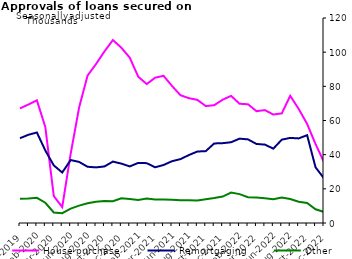
| Category | House purchase | Remortgaging | Other |
|---|---|---|---|
| Dec-2019 | 67092 | 49637 | 14252 |
| Jan-2020 | 69379 | 51656 | 14398 |
| Feb-2020 | 71805 | 52975 | 14713 |
| Mar-2020 | 56132 | 42424 | 11860 |
| Apr-2020 | 15789 | 33720 | 6146 |
| May-2020 | 9307 | 29560 | 5745 |
| Jun-2020 | 40523 | 36851 | 8426 |
| Jul-2020 | 67615 | 35757 | 10152 |
| Aug-2020 | 86290 | 32913 | 11586 |
| Sep-2020 | 93045 | 32547 | 12443 |
| Oct-2020 | 100414 | 33102 | 12909 |
| Nov-2020 | 107095 | 35948 | 12718 |
| Dec-2020 | 102616 | 34758 | 14508 |
| Jan-2021 | 96751 | 33130 | 14014 |
| Feb-2021 | 85649 | 35181 | 13481 |
| Mar-2021 | 81342 | 35029 | 14291 |
| Apr-2021 | 85050 | 32608 | 13761 |
| May-2021 | 86157 | 33959 | 13717 |
| Jun-2021 | 80218 | 36177 | 13608 |
| Jul-2021 | 74813 | 37389 | 13352 |
| Aug-2021 | 73064 | 39778 | 13356 |
| Sep-2021 | 72069 | 41843 | 13108 |
| Oct-2021 | 68455 | 42071 | 13962 |
| Nov-2021 | 68955 | 46568 | 14588 |
| Dec-2021 | 72181 | 46729 | 15458 |
| Jan-2022 | 74418 | 47270 | 17811 |
| Feb-2022 | 69796 | 49386 | 16909 |
| Mar-2022 | 69501 | 48945 | 15043 |
| Apr-2022 | 65455 | 46280 | 14911 |
| May-2022 | 66086 | 45878 | 14517 |
| Jun-2022 | 63487 | 43525 | 13868 |
| Jul-2022 | 64159 | 48782 | 14945 |
| Aug-2022 | 74443 | 49816 | 14085 |
| Sep-2022 | 66785 | 49510 | 12405 |
| Oct-2022 | 58018 | 51407 | 11688 |
| Nov-2022 | 46186 | 32588 | 8023 |
| Dec-2022 | 35612 | 26141 | 6467 |